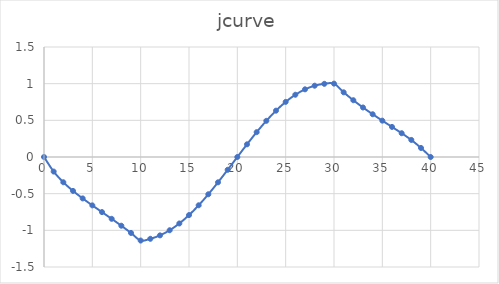
| Category | jcurve |
|---|---|
| 0.0 | 0 |
| 1.0 | -0.198 |
| 2.0 | -0.344 |
| 3.0 | -0.462 |
| 4.0 | -0.565 |
| 5.0 | -0.66 |
| 6.0 | -0.751 |
| 7.0 | -0.843 |
| 8.0 | -0.937 |
| 9.0 | -1.035 |
| 10.0 | -1.139 |
| 11.0 | -1.115 |
| 12.0 | -1.069 |
| 13.0 | -0.999 |
| 14.0 | -0.906 |
| 15.0 | -0.792 |
| 16.0 | -0.659 |
| 17.0 | -0.508 |
| 18.0 | -0.346 |
| 19.0 | -0.174 |
| 20.0 | 0 |
| 21.0 | 0.173 |
| 22.0 | 0.339 |
| 23.0 | 0.493 |
| 24.0 | 0.632 |
| 25.0 | 0.751 |
| 26.0 | 0.849 |
| 27.0 | 0.923 |
| 28.0 | 0.972 |
| 29.0 | 0.998 |
| 30.0 | 1 |
| 31.0 | 0.882 |
| 32.0 | 0.774 |
| 33.0 | 0.675 |
| 34.0 | 0.583 |
| 35.0 | 0.496 |
| 36.0 | 0.41 |
| 37.0 | 0.324 |
| 38.0 | 0.233 |
| 39.0 | 0.123 |
| 40.0 | 0 |